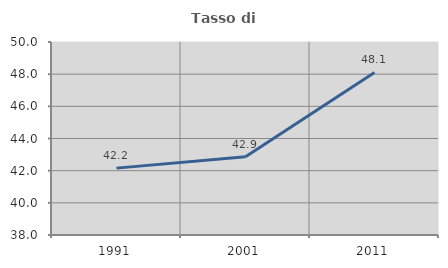
| Category | Tasso di occupazione   |
|---|---|
| 1991.0 | 42.158 |
| 2001.0 | 42.868 |
| 2011.0 | 48.104 |